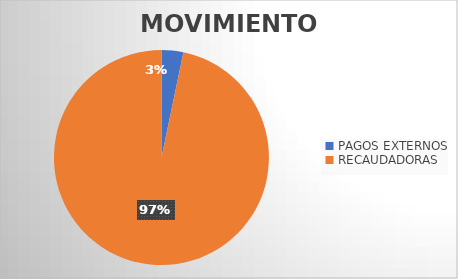
| Category | MOVIMIENTOS |
|---|---|
| PAGOS EXTERNOS | 595 |
| RECAUDADORAS | 17581 |